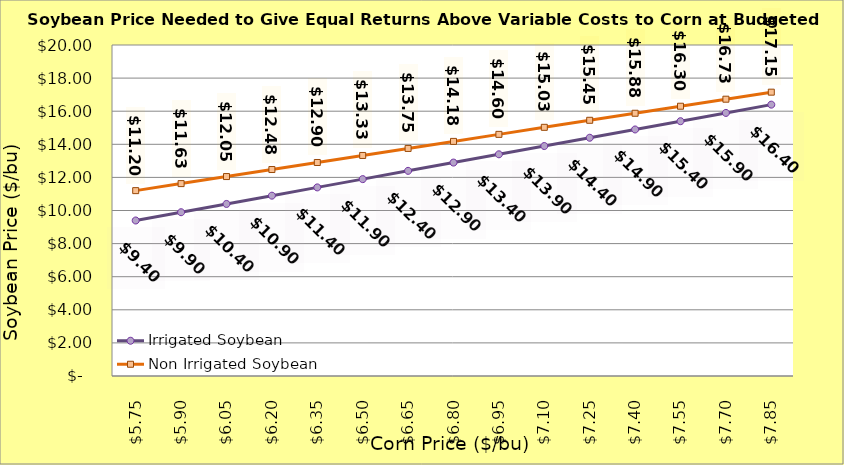
| Category | Irrigated Soybean | Non Irrigated Soybean |
|---|---|---|
| 5.749999999999997 | 9.396 | 11.201 |
| 5.899999999999998 | 9.896 | 11.626 |
| 6.049999999999998 | 10.396 | 12.051 |
| 6.199999999999998 | 10.896 | 12.476 |
| 6.349999999999999 | 11.396 | 12.901 |
| 6.499999999999999 | 11.896 | 13.326 |
| 6.6499999999999995 | 12.396 | 13.751 |
| 6.8 | 12.896 | 14.176 |
| 6.95 | 13.396 | 14.601 |
| 7.1000000000000005 | 13.896 | 15.026 |
| 7.250000000000001 | 14.396 | 15.451 |
| 7.400000000000001 | 14.896 | 15.876 |
| 7.550000000000002 | 15.396 | 16.301 |
| 7.700000000000002 | 15.896 | 16.726 |
| 7.850000000000002 | 16.396 | 17.151 |